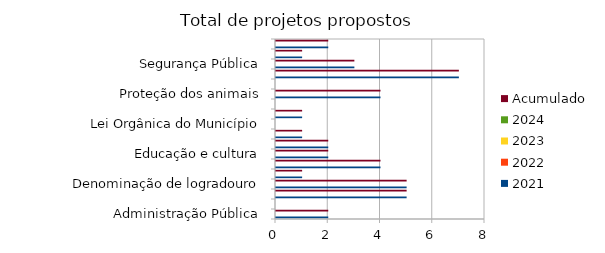
| Category | 2021 | 2022 | 2023 | 2024 | Acumulado |
|---|---|---|---|---|---|
| Administração Pública | 2 |  |  |  | 2 |
| Combate à corrupção  | 0 |  |  |  | 0 |
| Datas comemorativas e homenagens diversas | 5 |  |  |  | 5 |
| Denominação de logradouro | 5 |  |  |  | 5 |
| Desenvolvimento Econômico | 1 |  |  |  | 1 |
| Desenvolvimento Social  | 4 |  |  |  | 4 |
| Educação e cultura | 2 |  |  |  | 2 |
| Frente parlamentar | 2 |  |  |  | 2 |
| Habitação e Urbanismo | 1 |  |  |  | 1 |
| Lei Orgânica do Município | 0 |  |  |  | 0 |
| Meio ambiente  | 1 |  |  |  | 1 |
| Mobilidade | 0 |  |  |  | 0 |
| Proteção dos animais | 4 |  |  |  | 4 |
| Regimento Interno da CMSP | 0 |  |  |  | 0 |
| Saude-Esporte | 7 |  |  |  | 7 |
| Segurança Pública | 3 |  |  |  | 3 |
| Transparencia | 1 |  |  |  | 1 |
| Tributação | 2 |  |  |  | 2 |